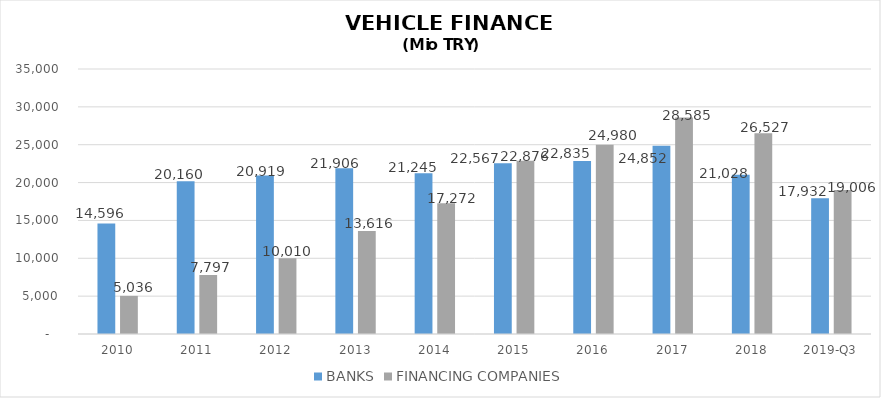
| Category | BANKS | FINANCING COMPANIES |
|---|---|---|
| 2010 | 14596 | 5035.89 |
| 2011 | 20160 | 7796.854 |
| 2012 | 20919 | 10009.755 |
| 2013 | 21906 | 13616.036 |
| 2014 | 21245 | 17271.844 |
| 2015 | 22567 | 22875.563 |
| 2016 | 22835 | 24980.231 |
| 2017 | 24852 | 28584.938 |
| 2018 | 21028 | 26527.133 |
| 2019-Q3 | 17932 | 19006.22 |